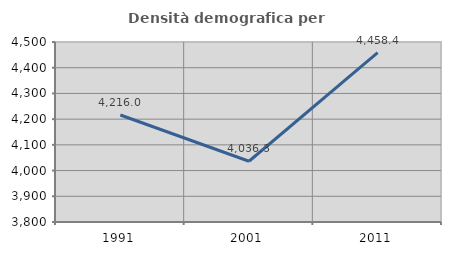
| Category | Densità demografica |
|---|---|
| 1991.0 | 4216.033 |
| 2001.0 | 4036.303 |
| 2011.0 | 4458.354 |